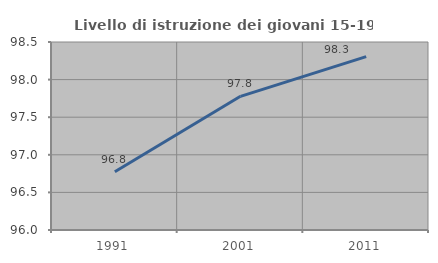
| Category | Livello di istruzione dei giovani 15-19 anni |
|---|---|
| 1991.0 | 96.774 |
| 2001.0 | 97.778 |
| 2011.0 | 98.305 |